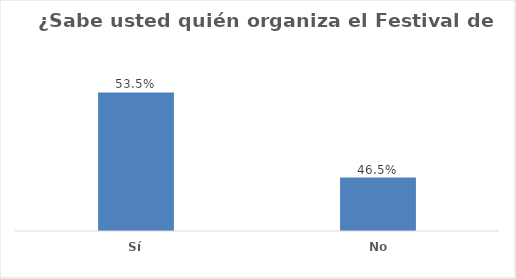
| Category | Series 0 |
|---|---|
| Sí | 0.535 |
| No | 0.465 |